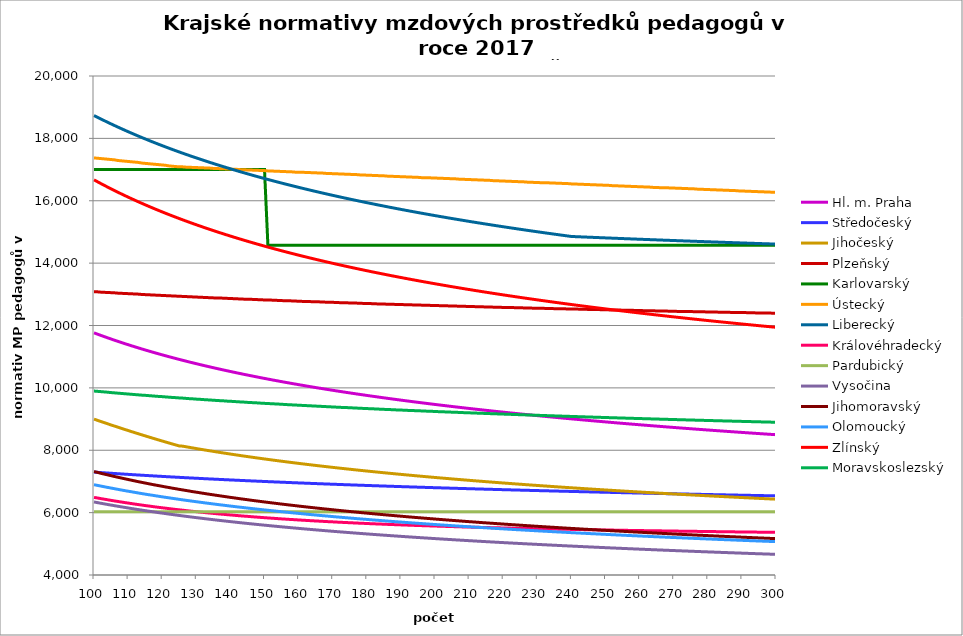
| Category | Hl. m. Praha | Středočeský | Jihočeský | Plzeňský | Karlovarský  | Ústecký   | Liberecký | Královéhradecký | Pardubický | Vysočina | Jihomoravský | Olomoucký | Zlínský | Moravskoslezský |
|---|---|---|---|---|---|---|---|---|---|---|---|---|---|---|
| 100.0 | 11764.272 | 7299.806 | 8997.889 | 13084.925 | 17000 | 17373.725 | 18732.726 | 6489.058 | 6030.48 | 6341.746 | 7317.364 | 6896.142 | 16670.123 | 9898.22 |
| 101.0 | 11723.47 | 7292.105 | 8960.003 | 13079.61 | 17000 | 17363.309 | 18677.307 | 6469.96 | 6030.48 | 6321.14 | 7290.394 | 6873.282 | 16610.569 | 9888.958 |
| 102.0 | 11683.347 | 7284.496 | 8922.434 | 13068.994 | 17000 | 17352.906 | 18622.755 | 6449.623 | 6030.48 | 6300.918 | 7261.955 | 6852.082 | 16552.021 | 9879.713 |
| 103.0 | 11643.886 | 7276.977 | 8885.178 | 13063.692 | 17000 | 17342.515 | 18569.049 | 6430.756 | 6030.48 | 6280.949 | 7235.391 | 6829.513 | 16494.448 | 9870.486 |
| 104.0 | 11605.068 | 7269.545 | 8848.233 | 13058.394 | 17000 | 17332.136 | 18516.166 | 6412 | 6030.48 | 6261.23 | 7210.663 | 6808.581 | 16437.826 | 9861.275 |
| 105.0 | 11566.876 | 7262.2 | 8811.594 | 13053.101 | 17000 | 17321.77 | 18464.085 | 6393.353 | 6030.48 | 6241.88 | 7184.472 | 6787.778 | 16382.127 | 9849.021 |
| 106.0 | 11529.293 | 7254.939 | 8775.256 | 13047.812 | 17000 | 17311.417 | 18412.787 | 6374.814 | 6030.48 | 6222.894 | 7158.471 | 6767.102 | 16327.327 | 9839.851 |
| 107.0 | 11492.303 | 7247.76 | 8739.218 | 13037.247 | 17000 | 17290.746 | 18362.249 | 6357.695 | 6030.48 | 6204.144 | 7134.265 | 6746.551 | 16273.402 | 9830.698 |
| 108.0 | 11455.89 | 7240.662 | 8703.474 | 13031.971 | 17000 | 17280.43 | 18312.455 | 6340.667 | 6030.48 | 6185.627 | 7110.222 | 6726.125 | 16220.328 | 9821.561 |
| 109.0 | 11420.039 | 7233.644 | 8668.021 | 13026.699 | 17000 | 17270.125 | 18263.386 | 6322.432 | 6030.48 | 6167.461 | 7086.341 | 6705.821 | 16168.084 | 9812.442 |
| 110.0 | 11384.737 | 7226.702 | 8632.856 | 13021.431 | 17000 | 17259.833 | 18215.023 | 6306.885 | 6030.48 | 6149.639 | 7062.62 | 6687.078 | 16116.649 | 9803.34 |
| 111.0 | 11349.969 | 7219.837 | 8597.975 | 13016.168 | 17000 | 17249.553 | 18167.35 | 6290.129 | 6030.48 | 6131.92 | 7039.057 | 6668.439 | 16066 | 9794.254 |
| 112.0 | 11315.721 | 7213.046 | 8563.375 | 13010.909 | 17000 | 17239.286 | 18120.35 | 6273.461 | 6030.48 | 6114.539 | 7015.651 | 6648.482 | 16016.119 | 9785.185 |
| 113.0 | 11281.982 | 7206.328 | 8529.052 | 13005.654 | 17000 | 17229.03 | 18074.007 | 6258.154 | 6030.48 | 6097.373 | 6992.399 | 6630.058 | 15966.985 | 9776.133 |
| 114.0 | 11248.737 | 7199.682 | 8495.003 | 12995.157 | 17000 | 17208.556 | 18028.306 | 6242.921 | 6030.48 | 6080.537 | 6970.837 | 6611.735 | 15918.582 | 9767.098 |
| 115.0 | 11215.976 | 7193.106 | 8461.225 | 12989.915 | 17000 | 17198.337 | 17983.232 | 6226.502 | 6030.48 | 6063.909 | 6949.407 | 6593.513 | 15870.89 | 9761.084 |
| 116.0 | 11183.686 | 7186.598 | 8427.714 | 12984.677 | 17000 | 17188.131 | 17938.77 | 6212.677 | 6030.48 | 6047.487 | 6926.592 | 6575.391 | 15823.892 | 9752.076 |
| 117.0 | 11151.856 | 7180.158 | 8394.468 | 12979.444 | 17000 | 17177.936 | 17894.905 | 6197.664 | 6030.48 | 6031.269 | 6905.433 | 6558.752 | 15777.571 | 9743.085 |
| 118.0 | 11120.476 | 7173.785 | 8361.484 | 12974.214 | 17000 | 17167.753 | 17851.626 | 6182.724 | 6030.48 | 6015.366 | 6884.403 | 6540.82 | 15731.911 | 9734.111 |
| 119.0 | 11089.534 | 7167.476 | 8328.757 | 12968.989 | 17000 | 17157.583 | 17808.918 | 6169.092 | 6030.48 | 5999.546 | 6864.989 | 6524.355 | 15686.897 | 9725.153 |
| 120.0 | 11059.021 | 7161.231 | 8296.286 | 12963.768 | 17000 | 17147.425 | 17766.768 | 6155.52 | 6030.48 | 5984.035 | 6844.204 | 6506.611 | 15642.514 | 9719.191 |
| 121.0 | 11028.926 | 7155.048 | 8264.066 | 12958.551 | 17000 | 17137.278 | 17725.165 | 6142.008 | 6030.48 | 5968.716 | 6823.545 | 6490.317 | 15598.746 | 9710.26 |
| 122.0 | 10999.24 | 7148.927 | 8232.096 | 12953.339 | 17000 | 17117.021 | 17684.097 | 6128.554 | 6030.48 | 5953.588 | 6804.472 | 6474.105 | 15555.579 | 9701.346 |
| 123.0 | 10969.954 | 7142.866 | 8200.373 | 12948.13 | 17000 | 17106.911 | 17643.551 | 6115.16 | 6030.48 | 5938.647 | 6784.051 | 6457.973 | 15513.001 | 9692.449 |
| 124.0 | 10941.059 | 7136.865 | 8168.893 | 12942.926 | 17000 | 17096.812 | 17603.517 | 6101.824 | 6030.48 | 5923.892 | 6765.199 | 6441.922 | 15470.996 | 9686.526 |
| 125.0 | 10912.546 | 7130.921 | 8137.654 | 12937.726 | 17000 | 17086.726 | 17563.983 | 6089.751 | 6030.48 | 5909.43 | 6746.451 | 6425.95 | 15429.554 | 9677.656 |
| 126.0 | 10884.407 | 7125.035 | 8131.23 | 12932.53 | 17000 | 17086.726 | 17524.94 | 6077.725 | 6030.48 | 5895.038 | 6727.806 | 6410.058 | 15388.66 | 9671.751 |
| 127.0 | 10856.633 | 7119.205 | 8111.686 | 12927.338 | 17000 | 17076.651 | 17486.376 | 6064.552 | 6030.48 | 5880.935 | 6709.264 | 6394.243 | 15348.303 | 9662.908 |
| 128.0 | 10829.217 | 7113.43 | 8092.387 | 12922.151 | 17000 | 17076.651 | 17448.282 | 6052.625 | 6030.48 | 5866.899 | 6690.825 | 6379.815 | 15308.471 | 9654.08 |
| 129.0 | 10802.151 | 7107.709 | 8073.329 | 12916.968 | 17000 | 17066.588 | 17410.648 | 6040.746 | 6030.48 | 5853.037 | 6672.486 | 6364.15 | 15269.153 | 9648.205 |
| 130.0 | 10775.427 | 7102.042 | 8054.507 | 12911.788 | 17000 | 17066.588 | 17373.465 | 6030.094 | 6030.48 | 5839.456 | 6655.647 | 6349.857 | 15230.338 | 9639.404 |
| 131.0 | 10749.038 | 7096.427 | 8035.916 | 12906.613 | 17000 | 17056.537 | 17336.724 | 6018.303 | 6030.48 | 5825.938 | 6637.5 | 6335.628 | 15192.015 | 9633.546 |
| 132.0 | 10722.977 | 7090.863 | 8017.55 | 12901.442 | 17000 | 17056.537 | 17300.415 | 6007.73 | 6030.48 | 5812.589 | 6620.837 | 6320.179 | 15154.174 | 9624.772 |
| 133.0 | 10697.238 | 7085.35 | 7999.406 | 12896.276 | 17000 | 17046.498 | 17264.531 | 5996.026 | 6030.48 | 5799.514 | 6602.879 | 6306.083 | 15116.804 | 9618.932 |
| 134.0 | 10671.813 | 7079.886 | 7981.479 | 12891.113 | 17000 | 17046.498 | 17229.062 | 5985.531 | 6030.48 | 5786.496 | 6586.389 | 6292.049 | 15079.895 | 9610.185 |
| 135.0 | 10646.697 | 7074.472 | 7963.765 | 12885.954 | 17000 | 17036.471 | 17194 | 5975.073 | 6030.48 | 5773.643 | 6569.981 | 6278.078 | 15043.439 | 9604.362 |
| 136.0 | 10621.883 | 7069.106 | 7946.259 | 12880.8 | 17000 | 17036.471 | 17159.338 | 5964.651 | 6030.48 | 5760.951 | 6553.655 | 6264.169 | 15007.426 | 9595.642 |
| 137.0 | 10597.364 | 7063.787 | 7928.957 | 12880.8 | 17000 | 17026.455 | 17125.069 | 5954.266 | 6030.48 | 5748.418 | 6537.41 | 6250.322 | 14971.847 | 9589.837 |
| 138.0 | 10573.136 | 7058.515 | 7911.855 | 12875.65 | 17000 | 17026.455 | 17091.183 | 5945.065 | 6030.48 | 5736.044 | 6521.245 | 6237.786 | 14936.693 | 9584.039 |
| 139.0 | 10549.192 | 7053.288 | 7894.95 | 12870.504 | 17000 | 17016.451 | 17057.675 | 5934.747 | 6030.48 | 5723.723 | 6505.159 | 6224.054 | 14901.956 | 9575.355 |
| 140.0 | 10525.526 | 7048.107 | 7878.237 | 12865.362 | 17000 | 17016.451 | 17024.536 | 5925.606 | 6030.48 | 5711.661 | 6489.153 | 6210.383 | 14867.627 | 9569.574 |
| 141.0 | 10502.134 | 7042.97 | 7861.713 | 12860.224 | 17000 | 17006.459 | 16991.76 | 5916.494 | 6030.48 | 5699.65 | 6474.55 | 6198.007 | 14833.699 | 9563.801 |
| 142.0 | 10479.01 | 7037.877 | 7845.374 | 12855.09 | 17000 | 17006.459 | 16959.341 | 5906.275 | 6030.48 | 5687.79 | 6458.694 | 6184.45 | 14800.164 | 9555.154 |
| 143.0 | 10456.148 | 7032.827 | 7829.216 | 12849.96 | 17000 | 16996.479 | 16927.272 | 5897.222 | 6030.48 | 5676.082 | 6442.915 | 6172.177 | 14767.013 | 9549.398 |
| 144.0 | 10433.545 | 7027.819 | 7813.238 | 12844.834 | 17000 | 16996.479 | 16895.545 | 5888.196 | 6030.48 | 5664.523 | 6428.519 | 6159.952 | 14734.24 | 9543.648 |
| 145.0 | 10411.194 | 7022.853 | 7797.434 | 12839.713 | 17000 | 16986.51 | 16864.156 | 5880.321 | 6030.48 | 5653.011 | 6414.187 | 6146.561 | 14701.838 | 9535.038 |
| 146.0 | 10389.092 | 7017.928 | 7781.802 | 12839.713 | 17000 | 16986.51 | 16833.098 | 5871.347 | 6030.48 | 5641.746 | 6398.625 | 6134.438 | 14669.799 | 9529.306 |
| 147.0 | 10367.233 | 7013.043 | 7766.338 | 12834.595 | 17000 | 16976.553 | 16802.364 | 5862.4 | 6030.48 | 5630.527 | 6384.426 | 6122.362 | 14638.116 | 9523.581 |
| 148.0 | 10345.613 | 7008.198 | 7751.04 | 12829.482 | 17000 | 16976.553 | 16771.95 | 5854.594 | 6030.48 | 5619.451 | 6370.29 | 6110.334 | 14606.784 | 9517.863 |
| 149.0 | 10324.228 | 7003.393 | 7735.905 | 12824.373 | 17000 | 16966.608 | 16741.85 | 5845.698 | 6030.48 | 5608.419 | 6356.216 | 6098.353 | 14575.795 | 9509.298 |
| 150.0 | 10303.073 | 6998.626 | 7720.929 | 12819.268 | 17000 | 16966.608 | 16712.057 | 5837.936 | 6030.48 | 5597.627 | 6342.204 | 6086.419 | 14545.143 | 9503.597 |
| 151.0 | 10282.144 | 6993.897 | 7706.11 | 12814.166 | 14571.429 | 16956.674 | 16682.568 | 5830.195 | 6030.48 | 5586.878 | 6328.254 | 6074.531 | 14514.823 | 9497.903 |
| 152.0 | 10261.438 | 6989.206 | 7691.445 | 12814.166 | 14571.429 | 16956.674 | 16653.376 | 5822.474 | 6030.48 | 5576.169 | 6314.366 | 6063.872 | 14484.827 | 9492.216 |
| 153.0 | 10240.95 | 6984.552 | 7676.932 | 12809.069 | 14571.429 | 16946.752 | 16624.476 | 5814.774 | 6030.48 | 5565.697 | 6301.792 | 6052.072 | 14455.151 | 9486.535 |
| 154.0 | 10220.676 | 6979.934 | 7662.567 | 12803.976 | 14571.429 | 16946.752 | 16595.864 | 5807.094 | 6030.48 | 5555.264 | 6288.019 | 6040.319 | 14425.788 | 9480.861 |
| 155.0 | 10200.612 | 6975.352 | 7648.348 | 12798.887 | 14571.429 | 16936.842 | 16567.534 | 5799.435 | 6030.48 | 5544.967 | 6274.306 | 6029.779 | 14396.733 | 9475.194 |
| 156.0 | 10180.756 | 6970.806 | 7634.273 | 12793.802 | 14571.429 | 16936.842 | 16539.482 | 5792.885 | 6030.48 | 5534.804 | 6261.892 | 6018.111 | 14367.98 | 9466.706 |
| 157.0 | 10161.103 | 6966.294 | 7620.339 | 12793.802 | 14571.429 | 16926.943 | 16511.704 | 5785.263 | 6030.48 | 5524.679 | 6248.292 | 6007.649 | 14339.525 | 9461.056 |
| 158.0 | 10141.649 | 6961.817 | 7606.544 | 12788.721 | 14571.429 | 16926.943 | 16484.194 | 5778.746 | 6030.48 | 5514.687 | 6235.98 | 5996.067 | 14311.362 | 9455.413 |
| 159.0 | 10122.393 | 6957.374 | 7592.885 | 12783.644 | 14571.429 | 16917.056 | 16456.948 | 5772.243 | 6030.48 | 5504.73 | 6223.717 | 5985.681 | 14283.486 | 9449.776 |
| 160.0 | 10103.329 | 6952.964 | 7579.36 | 12778.571 | 14571.429 | 16917.056 | 16429.962 | 5764.675 | 6030.48 | 5495.001 | 6210.283 | 5975.331 | 14255.892 | 9444.147 |
| 161.0 | 10084.454 | 6948.588 | 7565.968 | 12773.503 | 14571.429 | 16917.056 | 16403.232 | 5758.204 | 6030.48 | 5485.21 | 6198.12 | 5965.017 | 14228.575 | 9438.523 |
| 162.0 | 10065.767 | 6944.243 | 7552.705 | 12773.503 | 14571.429 | 16907.18 | 16376.753 | 5751.747 | 6030.48 | 5475.644 | 6186.005 | 5953.599 | 14201.531 | 9432.907 |
| 163.0 | 10047.263 | 6939.932 | 7539.569 | 12768.438 | 14571.429 | 16907.18 | 16350.522 | 5745.305 | 6030.48 | 5466.11 | 6173.937 | 5943.359 | 14174.755 | 9427.297 |
| 164.0 | 10028.939 | 6935.651 | 7526.559 | 12763.377 | 14571.429 | 16897.316 | 16324.534 | 5738.877 | 6030.48 | 5456.704 | 6161.916 | 5933.155 | 14148.243 | 9421.694 |
| 165.0 | 10010.793 | 6931.402 | 7513.673 | 12758.32 | 14571.429 | 16897.316 | 16298.786 | 5732.464 | 6030.48 | 5447.33 | 6149.942 | 5922.986 | 14121.99 | 9416.097 |
| 166.0 | 9992.822 | 6927.184 | 7500.908 | 12758.32 | 14571.429 | 16887.464 | 16273.274 | 5727.131 | 6030.48 | 5438.082 | 6138.014 | 5912.852 | 14095.992 | 9410.508 |
| 167.0 | 9975.022 | 6922.996 | 7488.263 | 12753.267 | 14571.429 | 16887.464 | 16247.994 | 5720.743 | 6030.48 | 5428.865 | 6126.132 | 5902.752 | 14070.245 | 9404.924 |
| 168.0 | 9957.391 | 6918.838 | 7475.735 | 12748.219 | 14571.429 | 16877.622 | 16222.943 | 5714.371 | 6030.48 | 5419.864 | 6114.297 | 5893.803 | 14044.745 | 9399.348 |
| 169.0 | 9939.927 | 6914.71 | 7463.323 | 12743.174 | 14571.429 | 16877.622 | 16198.117 | 5709.071 | 6030.48 | 5410.801 | 6103.684 | 5883.768 | 14019.487 | 9393.778 |
| 170.0 | 9922.626 | 6910.611 | 7451.026 | 12743.174 | 14571.429 | 16867.793 | 16173.513 | 5703.781 | 6030.48 | 5401.952 | 6091.935 | 5873.768 | 13994.468 | 9388.214 |
| 171.0 | 9905.486 | 6906.541 | 7438.84 | 12738.133 | 14571.429 | 16867.793 | 16149.127 | 5697.445 | 6030.48 | 5393.041 | 6080.231 | 5863.801 | 13969.685 | 9382.658 |
| 172.0 | 9888.505 | 6902.5 | 7426.765 | 12733.096 | 14571.429 | 16857.974 | 16124.956 | 5692.177 | 6030.48 | 5384.341 | 6069.735 | 5854.97 | 13945.133 | 9377.107 |
| 173.0 | 9871.68 | 6898.486 | 7414.799 | 12728.063 | 14571.429 | 16857.974 | 16100.997 | 5686.918 | 6030.48 | 5375.67 | 6058.116 | 5845.067 | 13920.808 | 9371.564 |
| 174.0 | 9855.009 | 6894.5 | 7402.94 | 12728.063 | 14571.429 | 16848.168 | 16077.246 | 5681.669 | 6030.48 | 5367.026 | 6047.697 | 5836.292 | 13896.708 | 9368.794 |
| 175.0 | 9838.488 | 6890.542 | 7391.186 | 12723.034 | 14571.429 | 16848.168 | 16053.701 | 5676.429 | 6030.48 | 5358.501 | 6036.163 | 5826.452 | 13872.828 | 9363.26 |
| 176.0 | 9822.117 | 6886.611 | 7379.537 | 12718.009 | 14571.429 | 16838.372 | 16030.358 | 5671.2 | 6030.48 | 5350.093 | 6025.819 | 5817.733 | 13849.166 | 9357.733 |
| 177.0 | 9805.893 | 6882.706 | 7367.989 | 12718.009 | 14571.429 | 16838.372 | 16007.215 | 5665.979 | 6030.48 | 5341.711 | 6015.51 | 5807.955 | 13825.718 | 9352.212 |
| 178.0 | 9789.813 | 6878.828 | 7356.543 | 12712.989 | 14571.429 | 16828.588 | 15984.268 | 5660.769 | 6030.48 | 5333.445 | 6004.098 | 5799.291 | 13802.48 | 9346.698 |
| 179.0 | 9773.875 | 6874.976 | 7345.196 | 12707.972 | 14571.429 | 16828.588 | 15961.515 | 5656.607 | 6030.48 | 5325.205 | 5993.864 | 5790.654 | 13779.45 | 9341.19 |
| 180.0 | 9758.077 | 6871.15 | 7333.946 | 12707.972 | 14571.429 | 16818.815 | 15938.953 | 5651.414 | 6030.48 | 5316.991 | 5983.664 | 5782.041 | 13756.624 | 9335.689 |
| 181.0 | 9742.418 | 6867.349 | 7322.793 | 12702.959 | 14571.429 | 16818.815 | 15916.579 | 5646.23 | 6030.48 | 5308.979 | 5973.499 | 5772.383 | 13734 | 9332.941 |
| 182.0 | 9726.894 | 6863.573 | 7311.736 | 12697.95 | 14571.429 | 16809.054 | 15894.39 | 5642.09 | 6030.48 | 5300.903 | 5963.369 | 5763.825 | 13711.574 | 9327.449 |
| 183.0 | 9711.505 | 6859.822 | 7300.772 | 12692.944 | 14571.429 | 16809.054 | 15872.384 | 5636.923 | 6030.48 | 5292.939 | 5953.273 | 5755.292 | 13689.343 | 9321.964 |
| 184.0 | 9696.247 | 6856.095 | 7289.9 | 12692.944 | 14571.429 | 16799.304 | 15850.559 | 5632.796 | 6030.48 | 5285.088 | 5943.211 | 5746.785 | 13667.305 | 9316.485 |
| 185.0 | 9681.12 | 6852.393 | 7279.119 | 12687.943 | 14571.429 | 16799.304 | 15828.911 | 5628.676 | 6030.48 | 5277.26 | 5933.183 | 5738.303 | 13645.456 | 9311.013 |
| 186.0 | 9666.121 | 6848.715 | 7268.428 | 12682.946 | 14571.429 | 16789.565 | 15807.439 | 5623.534 | 6030.48 | 5269.543 | 5923.189 | 5729.845 | 13623.795 | 9308.28 |
| 187.0 | 9651.249 | 6845.06 | 7257.825 | 12682.946 | 14571.429 | 16789.565 | 15786.139 | 5619.427 | 6030.48 | 5261.848 | 5914.334 | 5721.413 | 13602.318 | 9302.817 |
| 188.0 | 9636.501 | 6841.428 | 7247.31 | 12677.953 | 14571.429 | 16779.838 | 15765.01 | 5615.326 | 6030.48 | 5254.263 | 5904.403 | 5713.005 | 13581.022 | 9297.361 |
| 189.0 | 9621.876 | 6837.82 | 7236.88 | 12672.963 | 14571.429 | 16779.838 | 15744.049 | 5611.231 | 6030.48 | 5246.699 | 5894.505 | 5704.622 | 13559.906 | 9291.911 |
| 190.0 | 9607.372 | 6834.235 | 7226.535 | 12672.963 | 14571.429 | 16770.122 | 15723.254 | 5607.142 | 6030.48 | 5239.157 | 5885.736 | 5697.307 | 13538.966 | 9289.188 |
| 191.0 | 9592.988 | 6830.672 | 7216.274 | 12667.978 | 14571.429 | 16770.122 | 15702.623 | 5603.058 | 6030.48 | 5231.724 | 5875.9 | 5688.97 | 13518.199 | 9283.748 |
| 192.0 | 9578.722 | 6827.131 | 7206.096 | 12662.996 | 14571.429 | 16760.417 | 15682.152 | 5598.981 | 6030.48 | 5224.311 | 5866.098 | 5680.658 | 13497.605 | 9278.314 |
| 193.0 | 9564.571 | 6823.612 | 7195.998 | 12662.996 | 14571.429 | 16760.417 | 15661.842 | 5594.91 | 6030.48 | 5217.005 | 5857.413 | 5672.369 | 13477.18 | 9275.6 |
| 194.0 | 9550.535 | 6820.116 | 7185.981 | 12658.019 | 14571.429 | 16750.723 | 15641.688 | 5590.845 | 6030.48 | 5209.72 | 5847.672 | 5665.137 | 13456.921 | 9270.175 |
| 195.0 | 9536.613 | 6816.64 | 7176.043 | 12658.019 | 14571.429 | 16750.723 | 15621.689 | 5587.8 | 6030.48 | 5202.54 | 5839.041 | 5656.893 | 13436.827 | 9264.757 |
| 196.0 | 9522.801 | 6813.186 | 7166.183 | 12653.045 | 14571.429 | 16741.04 | 15601.843 | 5583.745 | 6030.48 | 5195.38 | 5830.435 | 5649.7 | 13416.895 | 9262.051 |
| 197.0 | 9509.1 | 6809.753 | 7156.4 | 12648.075 | 14571.429 | 16741.04 | 15582.148 | 5579.695 | 6030.48 | 5188.324 | 5820.784 | 5641.502 | 13397.123 | 9256.642 |
| 198.0 | 9495.507 | 6806.341 | 7146.693 | 12648.075 | 14571.429 | 16741.04 | 15562.602 | 5576.662 | 6030.48 | 5181.288 | 5812.231 | 5634.348 | 13377.509 | 9251.24 |
| 199.0 | 9482.021 | 6802.95 | 7137.061 | 12643.11 | 14571.429 | 16731.369 | 15543.204 | 5572.624 | 6030.48 | 5174.271 | 5803.704 | 5626.194 | 13358.051 | 9248.541 |
| 200.0 | 9468.64 | 6799.578 | 7127.504 | 12638.148 | 14571.429 | 16731.369 | 15523.95 | 5569.598 | 6030.48 | 5167.357 | 5794.141 | 5619.079 | 13338.746 | 9243.149 |
| 201.0 | 9455.364 | 6796.227 | 7118.019 | 12638.148 | 14571.429 | 16721.709 | 15504.84 | 5565.57 | 6030.48 | 5160.461 | 5785.667 | 5610.969 | 13319.593 | 9237.762 |
| 202.0 | 9442.191 | 6792.896 | 7108.606 | 12633.189 | 14571.429 | 16721.709 | 15485.871 | 5562.552 | 6030.48 | 5153.667 | 5777.218 | 5603.892 | 13300.59 | 9235.071 |
| 203.0 | 9429.118 | 6789.585 | 7099.264 | 12633.189 | 14571.429 | 16712.06 | 15467.042 | 5559.538 | 6030.48 | 5146.892 | 5768.793 | 5596.833 | 13281.734 | 9229.694 |
| 204.0 | 9416.147 | 6786.293 | 7089.993 | 12628.235 | 14571.429 | 16712.06 | 15448.351 | 5555.523 | 6030.48 | 5140.134 | 5760.393 | 5589.792 | 13263.024 | 9224.324 |
| 205.0 | 9403.273 | 6783.02 | 7080.791 | 12623.285 | 14571.429 | 16702.422 | 15429.796 | 5552.517 | 6030.48 | 5133.477 | 5752.017 | 5581.766 | 13244.458 | 9221.64 |
| 206.0 | 9390.498 | 6779.766 | 7071.658 | 12623.285 | 14571.429 | 16702.422 | 15411.375 | 5549.513 | 6030.48 | 5126.837 | 5743.666 | 5574.763 | 13226.033 | 9216.279 |
| 207.0 | 9377.819 | 6776.531 | 7062.592 | 12618.339 | 14571.429 | 16692.795 | 15393.088 | 5546.513 | 6030.48 | 5120.297 | 5735.339 | 5567.777 | 13207.748 | 9213.601 |
| 208.0 | 9365.234 | 6773.315 | 7053.592 | 12613.396 | 14571.429 | 16692.795 | 15374.931 | 5542.518 | 6030.48 | 5113.774 | 5727.036 | 5560.808 | 13189.602 | 9208.249 |
| 209.0 | 9352.744 | 6770.117 | 7044.659 | 12613.396 | 14571.429 | 16683.18 | 15356.904 | 5539.525 | 6030.48 | 5107.267 | 5718.757 | 5553.857 | 13171.592 | 9202.903 |
| 210.0 | 9340.346 | 6766.938 | 7035.791 | 12608.457 | 14571.429 | 16683.18 | 15339.005 | 5536.535 | 6030.48 | 5100.859 | 5710.502 | 5546.923 | 13153.717 | 9200.232 |
| 211.0 | 9328.04 | 6763.777 | 7026.987 | 12608.457 | 14571.429 | 16673.575 | 15321.233 | 5533.549 | 6030.48 | 5094.467 | 5703.298 | 5540.007 | 13135.975 | 9195.701 |
| 212.0 | 9315.824 | 6760.633 | 7018.247 | 12603.523 | 14571.429 | 16673.575 | 15303.585 | 5530.566 | 6030.48 | 5088.173 | 5695.087 | 5533.108 | 13118.365 | 9191.564 |
| 213.0 | 9303.697 | 6757.507 | 7009.569 | 12603.523 | 14571.429 | 16663.982 | 15286.061 | 5527.586 | 6030.48 | 5081.894 | 5686.9 | 5526.226 | 13100.884 | 9187.45 |
| 214.0 | 9291.659 | 6754.399 | 7000.953 | 12598.592 | 14571.429 | 16663.982 | 15268.658 | 5525.601 | 6030.48 | 5075.63 | 5678.737 | 5519.361 | 13083.531 | 9183.359 |
| 215.0 | 9279.707 | 6751.308 | 6992.398 | 12593.664 | 14571.429 | 16654.399 | 15251.376 | 5522.627 | 6030.48 | 5069.382 | 5671.613 | 5512.513 | 13066.304 | 9179.29 |
| 216.0 | 9267.841 | 6748.234 | 6983.904 | 12593.664 | 14571.429 | 16654.399 | 15234.213 | 5519.656 | 6030.48 | 5063.231 | 5663.493 | 5505.682 | 13049.203 | 9175.244 |
| 217.0 | 9256.061 | 6745.177 | 6975.469 | 12588.741 | 14571.429 | 16644.828 | 15217.168 | 5516.688 | 6030.48 | 5057.174 | 5656.408 | 5498.868 | 13032.225 | 9171.22 |
| 218.0 | 9244.364 | 6742.137 | 6967.094 | 12588.741 | 14571.429 | 16644.828 | 15200.239 | 5513.723 | 6030.48 | 5051.052 | 5648.331 | 5492.071 | 13015.368 | 9167.219 |
| 219.0 | 9232.75 | 6739.114 | 6958.777 | 12583.822 | 14571.429 | 16635.267 | 15183.424 | 5511.748 | 6030.48 | 5045.025 | 5641.283 | 5486.259 | 12998.632 | 9163.239 |
| 220.0 | 9221.218 | 6736.107 | 6950.517 | 12578.906 | 14571.429 | 16635.267 | 15166.723 | 5508.788 | 6030.48 | 5039.012 | 5633.25 | 5479.493 | 12982.016 | 9159.28 |
| 221.0 | 9209.767 | 6733.116 | 6942.314 | 12578.906 | 14571.429 | 16625.718 | 15150.135 | 5505.832 | 6030.48 | 5033.094 | 5626.24 | 5472.743 | 12965.516 | 9155.343 |
| 222.0 | 9198.395 | 6730.142 | 6934.168 | 12573.995 | 14571.429 | 16625.718 | 15133.657 | 5503.863 | 6030.48 | 5027.189 | 5618.25 | 5466.011 | 12949.133 | 9151.428 |
| 223.0 | 9187.103 | 6727.183 | 6926.077 | 12573.995 | 14571.429 | 16616.179 | 15117.289 | 5500.912 | 6030.48 | 5021.298 | 5611.277 | 5460.253 | 12932.864 | 9147.533 |
| 224.0 | 9175.888 | 6724.24 | 6918.041 | 12569.087 | 14571.429 | 16616.179 | 15101.029 | 5498.946 | 6030.48 | 5015.5 | 5604.321 | 5453.551 | 12916.709 | 9143.658 |
| 225.0 | 9164.751 | 6721.313 | 6910.059 | 12569.087 | 14571.429 | 16606.651 | 15084.876 | 5496 | 6030.48 | 5009.716 | 5596.393 | 5447.819 | 12900.666 | 9139.805 |
| 226.0 | 9153.69 | 6718.402 | 6902.131 | 12564.183 | 14571.429 | 16606.651 | 15068.83 | 5494.038 | 6030.48 | 5003.945 | 5589.474 | 5441.148 | 12884.733 | 9135.971 |
| 227.0 | 9142.705 | 6715.506 | 6894.256 | 12564.183 | 14571.429 | 16597.135 | 15052.888 | 5491.097 | 6030.48 | 4998.266 | 5582.572 | 5435.442 | 12868.91 | 9132.158 |
| 228.0 | 9131.793 | 6712.625 | 6886.434 | 12559.282 | 14571.429 | 16597.135 | 15037.049 | 5489.139 | 6030.48 | 4992.6 | 5575.687 | 5428.801 | 12853.195 | 9128.364 |
| 229.0 | 9120.956 | 6709.759 | 6878.663 | 12554.386 | 14571.429 | 16587.629 | 15021.313 | 5486.203 | 6030.48 | 4986.947 | 5567.84 | 5423.121 | 12837.587 | 9124.591 |
| 230.0 | 9110.191 | 6706.908 | 6870.943 | 12554.386 | 14571.429 | 16587.629 | 15005.678 | 5484.248 | 6030.48 | 4981.385 | 5560.991 | 5416.51 | 12822.084 | 9120.837 |
| 231.0 | 9099.498 | 6704.071 | 6863.275 | 12549.493 | 14571.429 | 16578.134 | 14990.144 | 5482.294 | 6030.48 | 4975.835 | 5554.159 | 5410.856 | 12806.686 | 9117.102 |
| 232.0 | 9088.876 | 6701.25 | 6855.656 | 12549.493 | 14571.429 | 16578.134 | 14974.708 | 5479.366 | 6030.48 | 4970.297 | 5547.344 | 5404.275 | 12791.391 | 9113.386 |
| 233.0 | 9078.324 | 6698.443 | 6848.087 | 12544.605 | 14571.429 | 16578.134 | 14959.37 | 5477.416 | 6030.48 | 4964.772 | 5540.546 | 5398.646 | 12776.198 | 9109.69 |
| 234.0 | 9067.842 | 6695.65 | 6840.567 | 12544.605 | 14571.429 | 16568.65 | 14944.13 | 5475.467 | 6030.48 | 4959.337 | 5533.765 | 5393.029 | 12761.106 | 9106.012 |
| 235.0 | 9057.429 | 6692.872 | 6833.095 | 12539.72 | 14571.429 | 16568.65 | 14928.985 | 5472.546 | 6030.48 | 4953.913 | 5527 | 5386.491 | 12746.114 | 9102.353 |
| 236.0 | 9047.083 | 6690.107 | 6825.672 | 12539.72 | 14571.429 | 16559.177 | 14913.934 | 5470.601 | 6030.48 | 4948.502 | 5520.251 | 5380.9 | 12731.22 | 9098.712 |
| 237.0 | 9036.805 | 6687.357 | 6818.295 | 12534.838 | 14571.429 | 16559.177 | 14898.978 | 5468.657 | 6030.48 | 4943.179 | 5513.519 | 5375.32 | 12716.424 | 9095.09 |
| 238.0 | 9026.594 | 6684.62 | 6810.966 | 12534.838 | 14571.429 | 16549.714 | 14884.114 | 5466.714 | 6030.48 | 4937.868 | 5506.804 | 5369.751 | 12701.724 | 9091.485 |
| 239.0 | 9016.448 | 6681.897 | 6803.683 | 12529.961 | 14571.429 | 16549.714 | 14869.342 | 5464.773 | 6030.48 | 4932.568 | 5500.104 | 5363.27 | 12687.12 | 9087.899 |
| 240.0 | 9006.367 | 6679.188 | 6796.446 | 12529.961 | 14571.429 | 16540.263 | 14854.661 | 5461.863 | 6030.48 | 4927.356 | 5493.421 | 5357.726 | 12672.61 | 9084.331 |
| 241.0 | 8996.35 | 6676.492 | 6789.254 | 12525.088 | 14571.429 | 16540.263 | 14850.033 | 5459.925 | 6030.48 | 4922.155 | 5487.706 | 5352.194 | 12658.193 | 9080.78 |
| 242.0 | 8986.397 | 6673.809 | 6782.107 | 12525.088 | 14571.429 | 16530.822 | 14845.427 | 5457.989 | 6030.48 | 4916.965 | 5481.053 | 5346.674 | 12643.868 | 9077.246 |
| 243.0 | 8976.506 | 6671.14 | 6775.005 | 12520.218 | 14571.429 | 16530.822 | 14840.843 | 5456.054 | 6030.48 | 4911.786 | 5474.416 | 5341.164 | 12629.635 | 9073.73 |
| 244.0 | 8966.678 | 6668.484 | 6767.946 | 12520.218 | 14571.429 | 16521.392 | 14836.28 | 5454.12 | 6030.48 | 4906.694 | 5467.795 | 5335.666 | 12615.492 | 9070.231 |
| 245.0 | 8956.912 | 6665.84 | 6760.931 | 12515.352 | 14571.429 | 16521.392 | 14831.739 | 5452.188 | 6030.48 | 4901.612 | 5462.133 | 5330.18 | 12601.438 | 9066.749 |
| 246.0 | 8947.207 | 6663.21 | 6753.959 | 12515.352 | 14571.429 | 16511.973 | 14827.219 | 5450.257 | 6030.48 | 4896.541 | 5455.542 | 5324.705 | 12587.473 | 9063.284 |
| 247.0 | 8937.561 | 6660.592 | 6747.03 | 12510.49 | 14571.429 | 16511.973 | 14822.72 | 5448.327 | 6030.48 | 4891.556 | 5448.967 | 5319.241 | 12573.595 | 9059.835 |
| 248.0 | 8927.976 | 6657.987 | 6740.142 | 12510.49 | 14571.429 | 16502.564 | 14818.242 | 5446.399 | 6030.48 | 4886.505 | 5443.344 | 5313.788 | 12559.804 | 9056.403 |
| 249.0 | 8918.449 | 6655.394 | 6733.296 | 12505.631 | 14571.429 | 16502.564 | 14813.785 | 5444.472 | 6030.48 | 4881.541 | 5436.798 | 5308.346 | 12546.098 | 9052.988 |
| 250.0 | 8908.981 | 6652.814 | 6726.492 | 12505.631 | 14571.429 | 16493.166 | 14809.348 | 5442.546 | 6030.48 | 4876.661 | 5431.2 | 5302.916 | 12532.476 | 9049.588 |
| 251.0 | 8899.57 | 6650.246 | 6719.728 | 12500.776 | 14571.429 | 16493.166 | 14804.932 | 5440.622 | 6030.48 | 4871.716 | 5424.683 | 5297.496 | 12518.939 | 9046.205 |
| 252.0 | 8890.217 | 6647.69 | 6713.005 | 12500.776 | 14571.429 | 16483.779 | 14800.536 | 5439.661 | 6030.48 | 4866.856 | 5419.11 | 5292.088 | 12505.484 | 9042.838 |
| 253.0 | 8880.92 | 6645.147 | 6706.322 | 12495.925 | 14571.429 | 16483.779 | 14796.16 | 5437.739 | 6030.48 | 4862.006 | 5412.622 | 5286.69 | 12492.111 | 9039.487 |
| 254.0 | 8871.679 | 6642.615 | 6699.678 | 12495.925 | 14571.429 | 16474.403 | 14791.803 | 5435.818 | 6030.48 | 4857.165 | 5407.073 | 5281.304 | 12478.82 | 9036.151 |
| 255.0 | 8862.494 | 6640.095 | 6693.074 | 12491.078 | 14571.429 | 16474.403 | 14787.467 | 5433.898 | 6030.48 | 4852.408 | 5400.614 | 5276.824 | 12465.608 | 9032.831 |
| 256.0 | 8853.363 | 6637.587 | 6686.508 | 12491.078 | 14571.429 | 16465.037 | 14783.149 | 5431.98 | 6030.48 | 4847.66 | 5395.09 | 5271.458 | 12452.477 | 9029.526 |
| 257.0 | 8844.287 | 6635.09 | 6679.981 | 12486.235 | 14571.429 | 16465.037 | 14778.852 | 5430.064 | 6030.48 | 4842.922 | 5388.66 | 5266.102 | 12439.423 | 9026.236 |
| 258.0 | 8835.264 | 6632.606 | 6673.491 | 12486.235 | 14571.429 | 16455.682 | 14774.573 | 5428.148 | 6030.48 | 4838.193 | 5383.16 | 5260.758 | 12426.448 | 9022.962 |
| 259.0 | 8826.295 | 6630.132 | 6667.04 | 12481.395 | 14571.429 | 16455.682 | 14770.313 | 5427.191 | 6030.48 | 4833.547 | 5377.672 | 5256.312 | 12413.55 | 9019.703 |
| 260.0 | 8817.378 | 6627.67 | 6660.625 | 12481.395 | 14571.429 | 16446.337 | 14766.072 | 5425.278 | 6030.48 | 4828.909 | 5371.283 | 5250.988 | 12400.728 | 9016.459 |
| 261.0 | 8808.514 | 6625.219 | 6654.248 | 12476.559 | 14571.429 | 16446.337 | 14761.85 | 5423.366 | 6030.48 | 4824.281 | 5365.819 | 5245.674 | 12387.982 | 9013.229 |
| 262.0 | 8799.701 | 6622.78 | 6647.907 | 12476.559 | 14571.429 | 16437.003 | 14757.647 | 5421.455 | 6030.48 | 4819.662 | 5360.366 | 5240.371 | 12375.31 | 9010.014 |
| 263.0 | 8790.939 | 6620.351 | 6641.602 | 12471.727 | 14571.429 | 16437.003 | 14753.462 | 5420.5 | 6030.48 | 4815.124 | 5354.018 | 5235.96 | 12362.713 | 9006.814 |
| 264.0 | 8782.227 | 6617.934 | 6635.333 | 12471.727 | 14571.429 | 16427.68 | 14749.295 | 5418.592 | 6030.48 | 4810.522 | 5348.589 | 5230.676 | 12350.189 | 9003.628 |
| 265.0 | 8773.566 | 6615.527 | 6629.099 | 12466.899 | 14571.429 | 16427.68 | 14745.146 | 5416.684 | 6030.48 | 4806.002 | 5343.171 | 5226.281 | 12337.737 | 9000.456 |
| 266.0 | 8764.955 | 6613.131 | 6622.901 | 12466.899 | 14571.429 | 16418.367 | 14741.015 | 5415.731 | 6030.48 | 4801.563 | 5337.764 | 5221.017 | 12325.357 | 8997.298 |
| 267.0 | 8756.392 | 6610.746 | 6616.737 | 12462.074 | 14571.429 | 16418.367 | 14736.902 | 5413.826 | 6030.48 | 4797.059 | 5332.367 | 5216.639 | 12313.048 | 8994.155 |
| 268.0 | 8747.878 | 6608.372 | 6610.608 | 12462.074 | 14571.429 | 16418.367 | 14732.807 | 5411.922 | 6030.48 | 4792.636 | 5326.982 | 5211.394 | 12300.81 | 8991.025 |
| 269.0 | 8739.412 | 6606.008 | 6604.513 | 12457.253 | 14571.429 | 16409.065 | 14728.729 | 5410.97 | 6030.48 | 4788.222 | 5320.713 | 5206.16 | 12288.642 | 8987.909 |
| 270.0 | 8730.994 | 6603.654 | 6598.451 | 12457.253 | 14571.429 | 16409.065 | 14724.668 | 5409.069 | 6030.48 | 4783.816 | 5315.351 | 5201.806 | 12276.542 | 8984.807 |
| 271.0 | 8722.623 | 6601.311 | 6592.423 | 12452.436 | 14571.429 | 16399.773 | 14720.625 | 5407.168 | 6030.48 | 4779.417 | 5310 | 5197.46 | 12264.511 | 8981.719 |
| 272.0 | 8714.299 | 6598.978 | 6586.429 | 12452.436 | 14571.429 | 16399.773 | 14716.599 | 5406.218 | 6030.48 | 4775.099 | 5304.66 | 5192.254 | 12252.548 | 8978.644 |
| 273.0 | 8706.022 | 6596.656 | 6580.467 | 12452.436 | 14571.429 | 16390.492 | 14712.59 | 5404.32 | 6030.48 | 4770.789 | 5299.33 | 5187.923 | 12240.651 | 8975.582 |
| 274.0 | 8697.79 | 6594.343 | 6574.537 | 12447.623 | 14571.429 | 16390.492 | 14708.597 | 5403.371 | 6030.48 | 4766.486 | 5294.011 | 5182.736 | 12228.822 | 8972.534 |
| 275.0 | 8689.604 | 6592.041 | 6568.64 | 12447.623 | 14571.429 | 16381.222 | 14704.622 | 5401.474 | 6030.48 | 4762.191 | 5288.703 | 5178.422 | 12217.058 | 8969.499 |
| 276.0 | 8681.462 | 6589.748 | 6562.775 | 12442.813 | 14571.429 | 16381.222 | 14700.662 | 5399.579 | 6030.48 | 4757.975 | 5283.406 | 5173.253 | 12205.359 | 8966.477 |
| 277.0 | 8673.365 | 6587.465 | 6556.941 | 12442.813 | 14571.429 | 16371.962 | 14696.72 | 5398.632 | 6030.48 | 4753.695 | 5278.119 | 5168.955 | 12193.725 | 8963.468 |
| 278.0 | 8665.313 | 6585.192 | 6551.139 | 12438.007 | 14571.429 | 16371.962 | 14692.793 | 5396.739 | 6030.48 | 4749.494 | 5273.721 | 5164.663 | 12182.154 | 8960.471 |
| 279.0 | 8657.304 | 6582.929 | 6545.368 | 12438.007 | 14571.429 | 16362.712 | 14688.883 | 5395.792 | 6030.48 | 4745.301 | 5268.453 | 5160.378 | 12170.648 | 8957.488 |
| 280.0 | 8649.339 | 6580.676 | 6539.627 | 12433.205 | 14571.429 | 16362.712 | 14684.989 | 5393.901 | 6030.48 | 4741.186 | 5263.196 | 5155.246 | 12159.204 | 8954.517 |
| 281.0 | 8641.416 | 6578.432 | 6533.917 | 12433.205 | 14571.429 | 16353.473 | 14681.111 | 5392.956 | 6030.48 | 4737.007 | 5257.95 | 5150.977 | 12147.822 | 8951.558 |
| 282.0 | 8633.536 | 6576.197 | 6528.237 | 12433.205 | 14571.429 | 16353.473 | 14677.249 | 5391.067 | 6030.48 | 4732.906 | 5252.714 | 5146.715 | 12136.501 | 8948.613 |
| 283.0 | 8625.699 | 6573.972 | 6522.587 | 12428.406 | 14571.429 | 16344.244 | 14673.402 | 5390.123 | 6030.48 | 4728.813 | 5247.488 | 5141.61 | 12125.242 | 8945.679 |
| 284.0 | 8617.903 | 6571.757 | 6516.967 | 12428.406 | 14571.429 | 16344.244 | 14669.571 | 5388.235 | 6030.48 | 4724.726 | 5243.141 | 5137.364 | 12114.043 | 8942.758 |
| 285.0 | 8610.148 | 6569.55 | 6511.376 | 12423.611 | 14571.429 | 16335.025 | 14665.755 | 5387.292 | 6030.48 | 4720.647 | 5237.934 | 5133.124 | 12102.904 | 8939.849 |
| 286.0 | 8602.435 | 6567.353 | 6505.814 | 12423.611 | 14571.429 | 16335.025 | 14661.955 | 5385.407 | 6030.48 | 4716.644 | 5232.738 | 5128.892 | 12091.825 | 8936.952 |
| 287.0 | 8594.762 | 6565.165 | 6500.281 | 12418.82 | 14571.429 | 16325.817 | 14658.17 | 5384.465 | 6030.48 | 4712.649 | 5227.552 | 5124.666 | 12080.804 | 8934.067 |
| 288.0 | 8587.129 | 6562.986 | 6494.777 | 12418.82 | 14571.429 | 16325.817 | 14654.4 | 5382.581 | 6030.48 | 4708.66 | 5223.238 | 5120.448 | 12069.842 | 8931.193 |
| 289.0 | 8579.537 | 6560.816 | 6489.301 | 12414.032 | 14571.429 | 16316.62 | 14650.645 | 5381.64 | 6030.48 | 4704.678 | 5218.071 | 5115.395 | 12058.937 | 8928.332 |
| 290.0 | 8571.984 | 6558.655 | 6483.853 | 12414.032 | 14571.429 | 16316.62 | 14646.905 | 5380.699 | 6030.48 | 4700.703 | 5212.914 | 5111.191 | 12048.09 | 8925.482 |
| 291.0 | 8564.47 | 6556.503 | 6478.433 | 12414.032 | 14571.429 | 16307.432 | 14643.179 | 5378.819 | 6030.48 | 4696.804 | 5208.624 | 5106.995 | 12037.299 | 8922.644 |
| 292.0 | 8556.995 | 6554.359 | 6473.04 | 12409.249 | 14571.429 | 16307.432 | 14639.469 | 5377.879 | 6030.48 | 4692.911 | 5203.486 | 5102.806 | 12026.565 | 8919.818 |
| 293.0 | 8549.559 | 6552.225 | 6467.675 | 12409.249 | 14571.429 | 16298.255 | 14635.773 | 5376 | 6030.48 | 4689.025 | 5198.357 | 5098.623 | 12015.886 | 8917.003 |
| 294.0 | 8542.16 | 6550.098 | 6462.337 | 12404.468 | 14571.429 | 16298.255 | 14632.091 | 5375.061 | 6030.48 | 4685.145 | 5194.092 | 5094.447 | 12005.263 | 8914.199 |
| 295.0 | 8534.8 | 6547.981 | 6457.026 | 12404.468 | 14571.429 | 16289.089 | 14628.424 | 5374.123 | 6030.48 | 4681.272 | 5188.982 | 5090.278 | 11994.694 | 8911.406 |
| 296.0 | 8527.477 | 6545.872 | 6451.742 | 12399.692 | 14571.429 | 16289.089 | 14624.771 | 5372.246 | 6030.48 | 4677.474 | 5184.731 | 5086.116 | 11984.18 | 8908.625 |
| 297.0 | 8520.192 | 6543.772 | 6446.484 | 12399.692 | 14571.429 | 16279.933 | 14621.132 | 5371.309 | 6030.48 | 4673.613 | 5179.64 | 5081.961 | 11973.719 | 8905.855 |
| 298.0 | 8512.943 | 6541.679 | 6441.252 | 12399.692 | 14571.429 | 16279.933 | 14617.507 | 5369.435 | 6030.48 | 4669.828 | 5175.405 | 5077.812 | 11963.312 | 8903.096 |
| 299.0 | 8505.73 | 6539.596 | 6436.046 | 12394.919 | 14571.429 | 16270.787 | 14613.896 | 5368.498 | 6030.48 | 4666.049 | 5170.332 | 5073.67 | 11952.957 | 8900.348 |
| 300.0 | 8498.554 | 6537.52 | 6430.866 | 12394.919 | 14571.429 | 16270.787 | 14610.299 | 5367.562 | 6030.48 | 4662.275 | 5166.112 | 5069.535 | 11942.655 | 8897.61 |